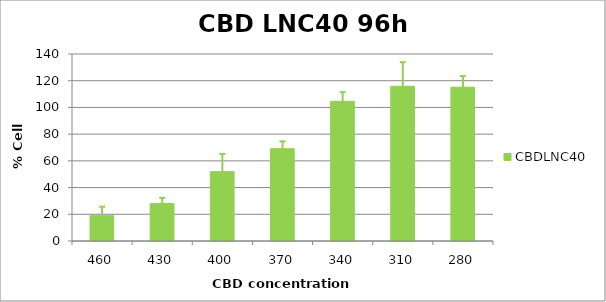
| Category | CBDLNC40 |
|---|---|
| 460.0 | 18.94 |
| 430.0 | 28.141 |
| 400.0 | 51.928 |
| 370.0 | 69.096 |
| 340.0 | 104.57 |
| 310.0 | 115.821 |
| 280.0 | 115.167 |